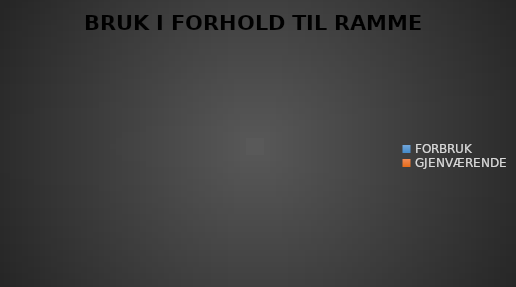
| Category | BRUK I FORHOLD TIL RAMME 2019 |
|---|---|
| FORBRUK | 0 |
| GJENVÆRENDE | 0 |